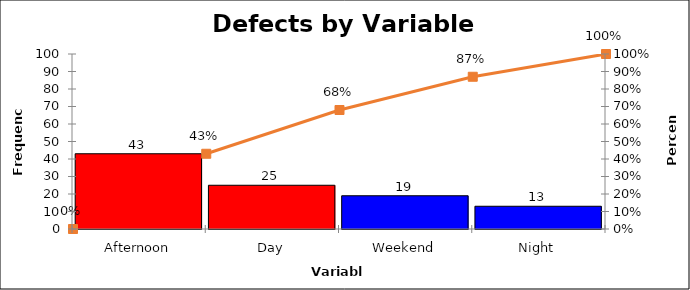
| Category | Freq |
|---|---|
| Afternoon | 43 |
| Day | 25 |
| Weekend | 19 |
| Night | 13 |